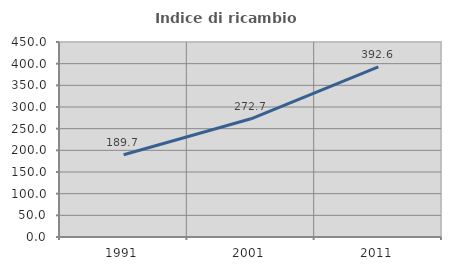
| Category | Indice di ricambio occupazionale  |
|---|---|
| 1991.0 | 189.655 |
| 2001.0 | 272.727 |
| 2011.0 | 392.593 |